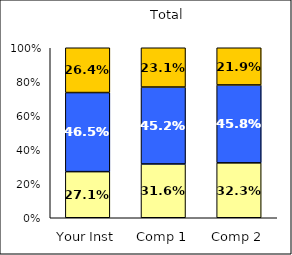
| Category | Low Academic Disengagement | Average Academic Disengagement | High Academic Disengagement |
|---|---|---|---|
| Your Inst | 0.271 | 0.465 | 0.264 |
| Comp 1 | 0.316 | 0.452 | 0.231 |
| Comp 2 | 0.323 | 0.458 | 0.219 |